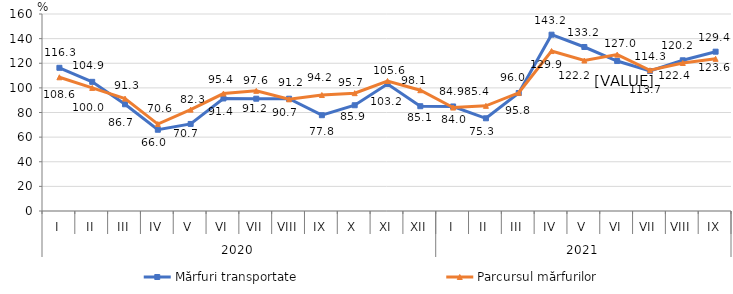
| Category | Mărfuri transportate | Parcursul mărfurilor |
|---|---|---|
| 0 | 116.3 | 108.6 |
| 1 | 104.9 | 100 |
| 2 | 86.7 | 91.3 |
| 3 | 66 | 70.6 |
| 4 | 70.7 | 82.3 |
| 5 | 91.4 | 95.4 |
| 6 | 91.2 | 97.6 |
| 7 | 91.2 | 90.7 |
| 8 | 77.8 | 94.2 |
| 9 | 85.9 | 95.7 |
| 10 | 103.2 | 105.6 |
| 11 | 85.1 | 98.1 |
| 12 | 84.9 | 84 |
| 13 | 75.3 | 85.4 |
| 14 | 95.8 | 96 |
| 15 | 143.2 | 129.9 |
| 16 | 133.2 | 122.2 |
| 17 | 121.8 | 127 |
| 18 | 113.7 | 114.3 |
| 19 | 122.4 | 120.2 |
| 20 | 129.4 | 123.6 |